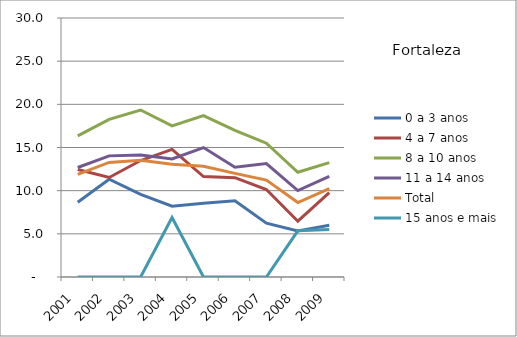
| Category | 0 a 3 anos | 4 a 7 anos | 8 a 10 anos | 11 a 14 anos | Total | 15 anos e mais |
|---|---|---|---|---|---|---|
| 2001.0 | 8.65 | 12.45 | 16.35 | 12.68 | 11.88 | 0 |
| 2002.0 | 11.33 | 11.53 | 18.26 | 14.03 | 13.27 | 0 |
| 2003.0 | 9.58 | 13.49 | 19.34 | 14.12 | 13.51 | 0 |
| 2004.0 | 8.21 | 14.78 | 17.51 | 13.68 | 13.05 | 6.9 |
| 2005.0 | 8.53 | 11.63 | 18.7 | 14.99 | 12.82 | 0 |
| 2006.0 | 8.82 | 11.5 | 16.99 | 12.71 | 12 | 0 |
| 2007.0 | 6.24 | 10.13 | 15.5 | 13.14 | 11.23 | 0 |
| 2008.0 | 5.32 | 6.46 | 12.13 | 10.01 | 8.62 | 5.35 |
| 2009.0 | 6 | 9.78 | 13.25 | 11.66 | 10.24 | 5.51 |